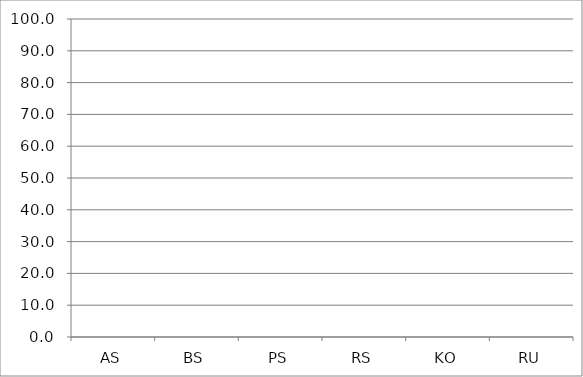
| Category | Series 0 |
|---|---|
| AS | 0 |
| BS | 0 |
| PS | 0 |
| RS | 0 |
| KO | 0 |
| RU | 0 |